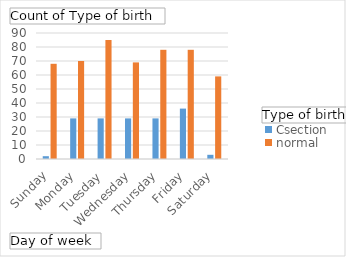
| Category | Csection | normal |
|---|---|---|
| Sunday | 2 | 68 |
| Monday | 29 | 70 |
| Tuesday | 29 | 85 |
| Wednesday | 29 | 69 |
| Thursday | 29 | 78 |
| Friday | 36 | 78 |
| Saturday | 3 | 59 |